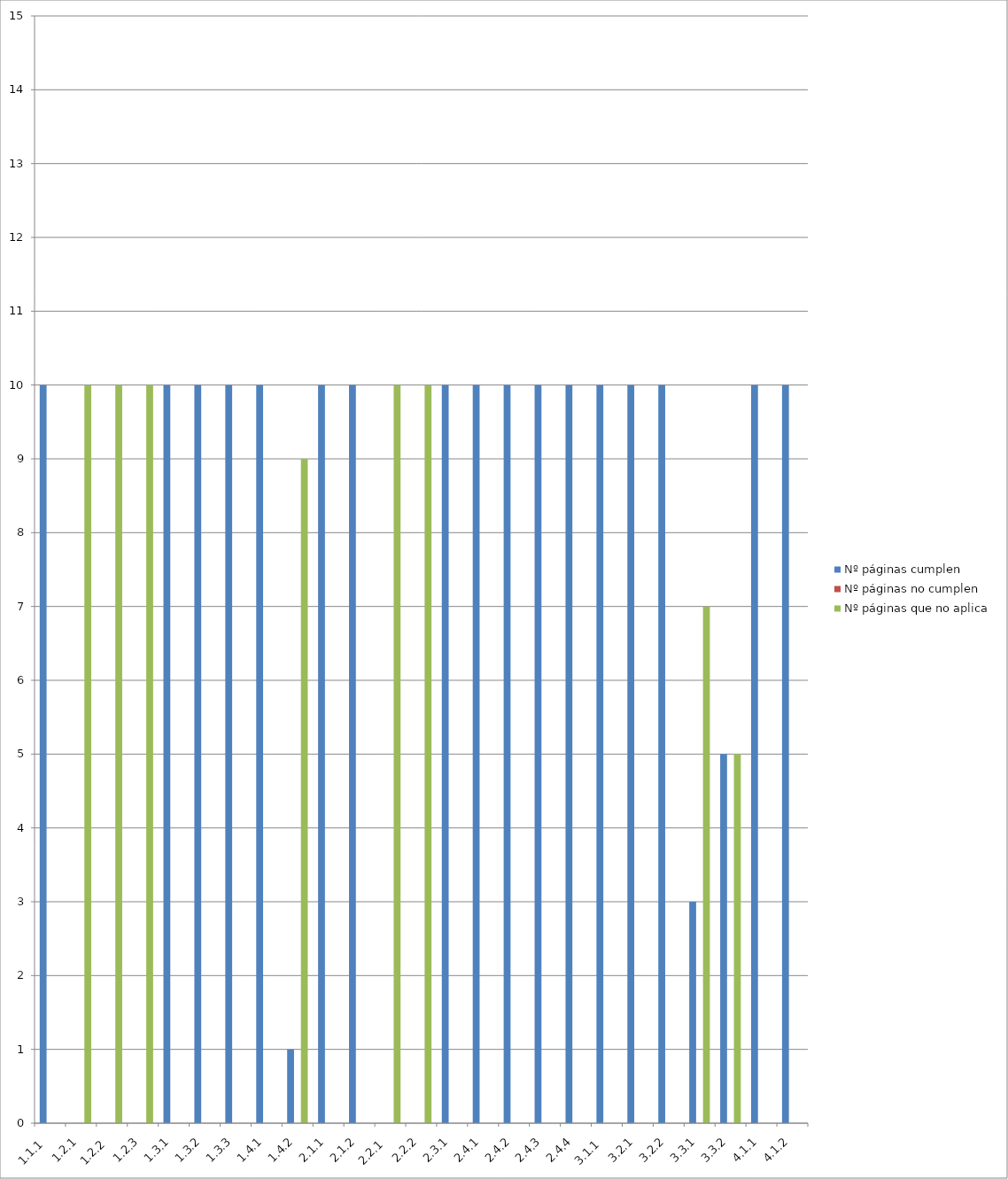
| Category | Nº páginas cumplen | Nº páginas no cumplen | Nº páginas que no aplica |
|---|---|---|---|
| 1.1.1  | 10 | 0 | 0 |
| 1.2.1 | 0 | 0 | 10 |
| 1.2.2  | 0 | 0 | 10 |
| 1.2.3 | 0 | 0 | 10 |
| 1.3.1 | 10 | 0 | 0 |
| 1.3.2 | 10 | 0 | 0 |
| 1.3.3 | 10 | 0 | 0 |
| 1.4.1 | 10 | 0 | 0 |
| 1.4.2 | 1 | 0 | 9 |
| 2.1.1 | 10 | 0 | 0 |
| 2.1.2 | 10 | 0 | 0 |
| 2.2.1  | 0 | 0 | 10 |
| 2.2.2 | 0 | 0 | 10 |
| 2.3.1 | 10 | 0 | 0 |
| 2.4.1 | 10 | 0 | 0 |
| 2.4.2 | 10 | 0 | 0 |
| 2.4.3 | 10 | 0 | 0 |
| 2.4.4 | 10 | 0 | 0 |
| 3.1.1  | 10 | 0 | 0 |
| 3.2.1 | 10 | 0 | 0 |
| 3.2.2 | 10 | 0 | 0 |
| 3.3.1 | 3 | 0 | 7 |
| 3.3.2 | 5 | 0 | 5 |
| 4.1.1 | 10 | 0 | 0 |
| 4.1.2 | 10 | 0 | 0 |